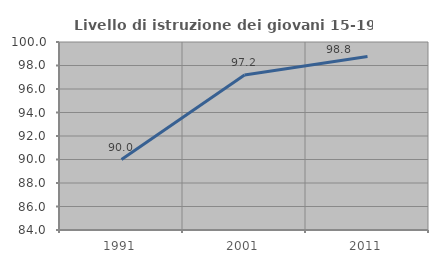
| Category | Livello di istruzione dei giovani 15-19 anni |
|---|---|
| 1991.0 | 90 |
| 2001.0 | 97.183 |
| 2011.0 | 98.765 |